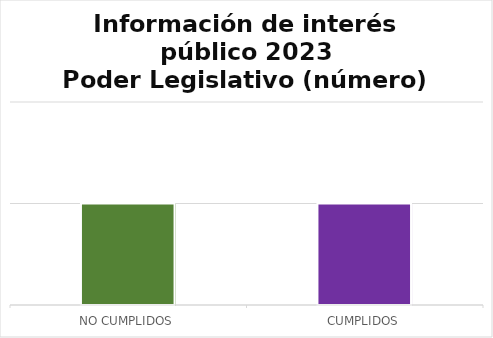
| Category | Series 0 |
|---|---|
| NO CUMPLIDOS | 1 |
| CUMPLIDOS | 1 |